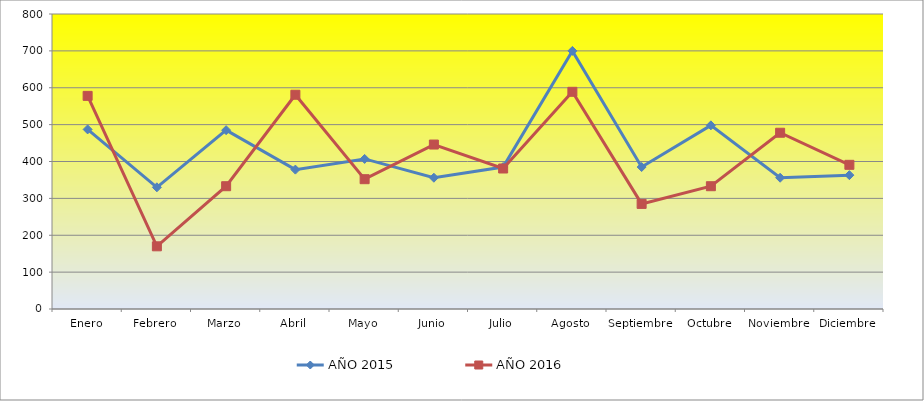
| Category | AÑO 2015 | AÑO 2016 |
|---|---|---|
| Enero | 487 | 578 |
| Febrero | 330 | 170 |
| Marzo | 485 | 333 |
| Abril | 378 | 581 |
| Mayo | 407 | 352 |
| Junio | 356 | 446 |
| Julio | 385 | 381 |
| Agosto | 700 | 589 |
| Septiembre | 385 | 285 |
| Octubre | 498 | 333 |
| Noviembre | 356 | 478 |
| Diciembre | 363 | 391 |